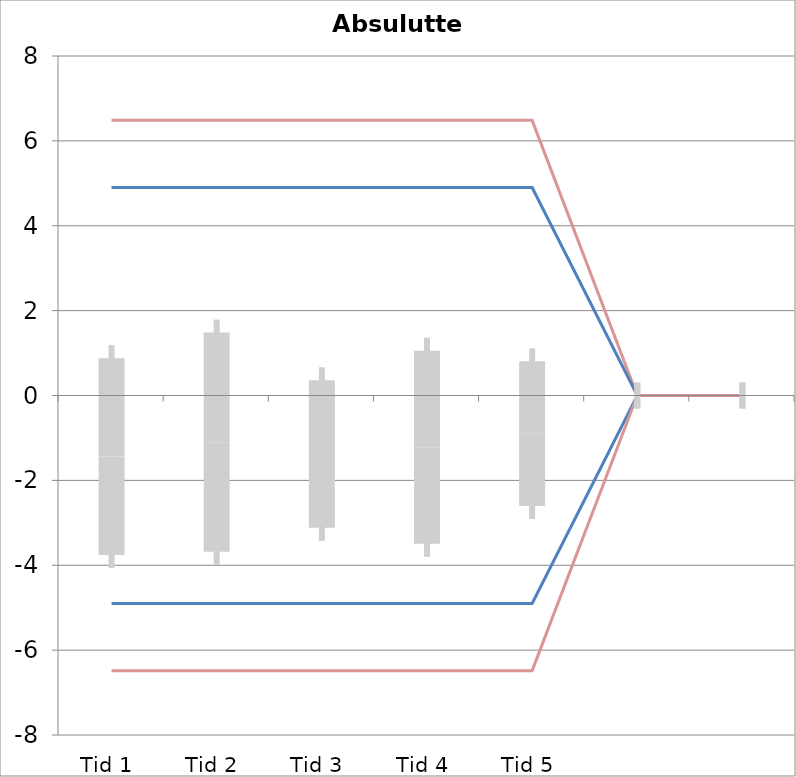
| Category | 1 | 2 | 3 | 4 | 5 | 6 | 7 | 8 | 9 | 10 | 11 | 12 | 13 | 14 | 15 | 16 | 17 | 18 | 19 | 20 | TEa | B | -B | -TEa | M |
|---|---|---|---|---|---|---|---|---|---|---|---|---|---|---|---|---|---|---|---|---|---|---|---|---|---|
| Tid 1 | -1.7 | -0.4 | -3.1 | 1.2 | -3.2 | 0 | 0 | 0 | 0 | 0 | 0 | 0 | 0 | 0 | 0 | 0 | 0 | 0 | 0 | 0 | 6.483 | 4.901 | -4.901 | -6.483 | -1.44 |
| Tid 2 | -1.3 | -0.5 | -3.2 | 2.1 | -2.6 | 0 | 0 | 0 | 0 | 0 | 0 | 0 | 0 | 0 | 0 | 0 | 0 | 0 | 0 | 0 | 6.483 | 4.901 | -4.901 | -6.483 | -1.1 |
| Tid 3 | -0.6 | -0.4 | -3 | -0.1 | -2.8 | 0 | 0 | 0 | 0 | 0 | 0 | 0 | 0 | 0 | 0 | 0 | 0 | 0 | 0 | 0 | 6.483 | 4.901 | -4.901 | -6.483 | -1.38 |
| Tid 4 | -0.3 | -0.5 | -2.6 | 0.9 | -3.6 | 0 | 0 | 0 | 0 | 0 | 0 | 0 | 0 | 0 | 0 | 0 | 0 | 0 | 0 | 0 | 6.483 | 4.901 | -4.901 | -6.483 | -1.22 |
| Tid 5 | -0.9 | 0.2 | -2 | 0.7 | -2.5 | 0 | 0 | 0 | 0 | 0 | 0 | 0 | 0 | 0 | 0 | 0 | 0 | 0 | 0 | 0 | 6.483 | 4.901 | -4.901 | -6.483 | -0.9 |